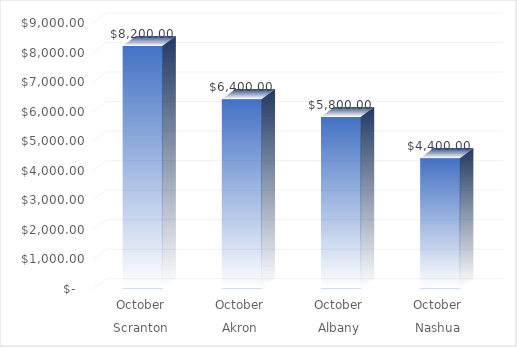
| Category | Series 0 |
|---|---|
| 0 | 8200 |
| 1 | 6400 |
| 2 | 5800 |
| 3 | 4400 |